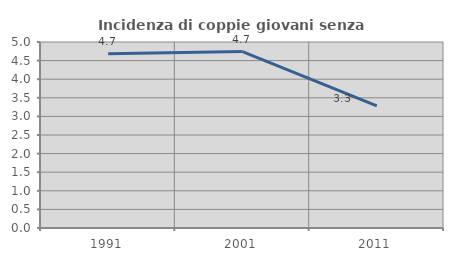
| Category | Incidenza di coppie giovani senza figli |
|---|---|
| 1991.0 | 4.681 |
| 2001.0 | 4.743 |
| 2011.0 | 3.284 |